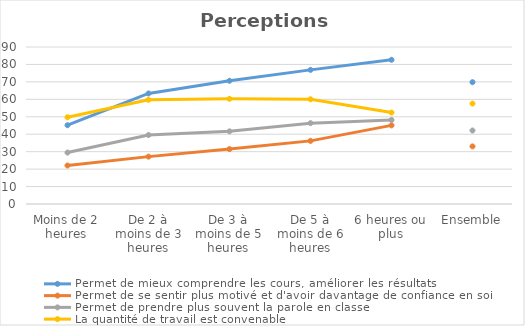
| Category | Permet de mieux comprendre les cours, améliorer les résultats | Permet de se sentir plus motivé et d'avoir davantage de confiance en soi | Permet de prendre plus souvent la parole en classe | La quantité de travail est convenable |
|---|---|---|---|---|
| Moins de 2 heures | 45.16 | 22.07 | 29.48 | 49.73 |
| De 2 à moins de 3 heures | 63.36 | 27.16 | 39.54 | 59.75 |
| De 3 à moins de 5 heures | 70.64 | 31.47 | 41.64 | 60.31 |
| De 5 à moins de 6 heures | 76.89 | 36.18 | 46.33 | 60.04 |
| 6 heures ou plus | 82.67 | 45.06 | 48.17 | 52.42 |
| Ensemble | 69.84 | 33.02 | 42.13 | 57.56 |